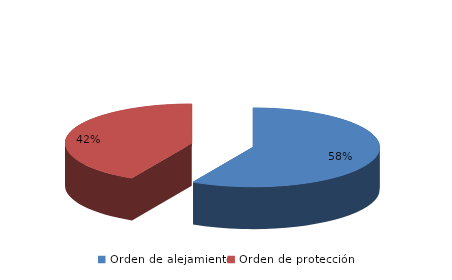
| Category | Series 0 |
|---|---|
| Orden de alejamiento | 962 |
| Orden de protección | 702 |